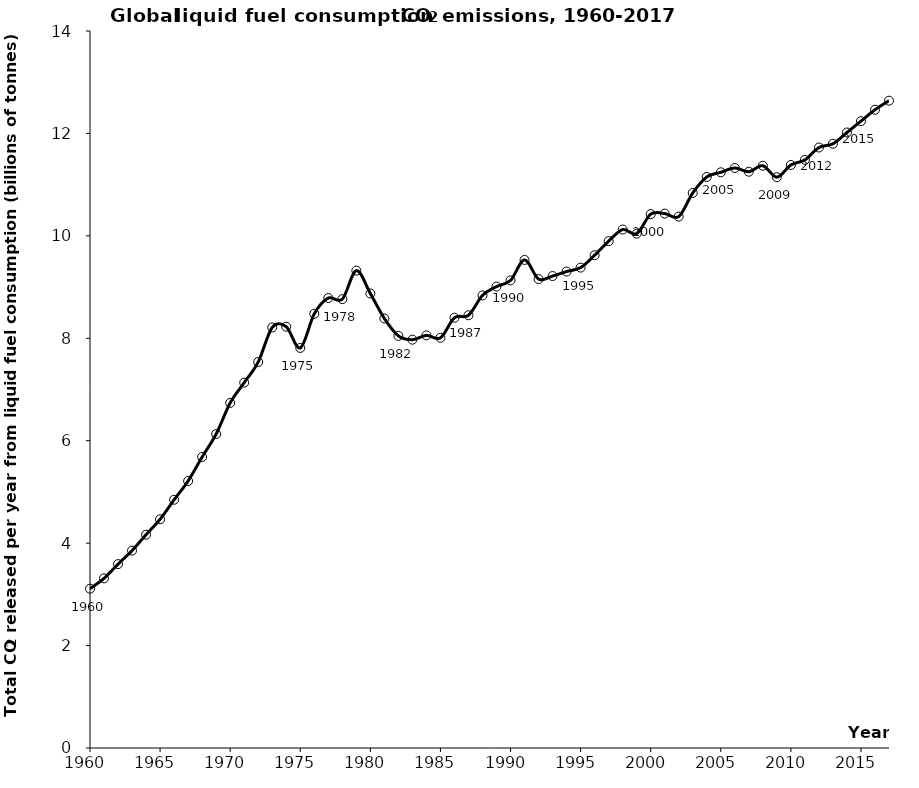
| Category | Series 0 |
|---|---|
| 1960.0 | 3.111 |
| 1961.0 | 3.312 |
| 1962.0 | 3.591 |
| 1963.0 | 3.855 |
| 1964.0 | 4.166 |
| 1965.0 | 4.466 |
| 1966.0 | 4.847 |
| 1967.0 | 5.214 |
| 1968.0 | 5.683 |
| 1969.0 | 6.13 |
| 1970.0 | 6.738 |
| 1971.0 | 7.134 |
| 1972.0 | 7.537 |
| 1973.0 | 8.211 |
| 1974.0 | 8.226 |
| 1975.0 | 7.812 |
| 1976.0 | 8.478 |
| 1977.0 | 8.786 |
| 1978.0 | 8.764 |
| 1979.0 | 9.321 |
| 1980.0 | 8.874 |
| 1981.0 | 8.387 |
| 1982.0 | 8.046 |
| 1983.0 | 7.973 |
| 1984.0 | 8.057 |
| 1985.0 | 8.01 |
| 1986.0 | 8.402 |
| 1987.0 | 8.449 |
| 1988.0 | 8.838 |
| 1989.0 | 9.01 |
| 1990.0 | 9.131 |
| 1991.0 | 9.53 |
| 1992.0 | 9.156 |
| 1993.0 | 9.215 |
| 1994.0 | 9.303 |
| 1995.0 | 9.38 |
| 1996.0 | 9.622 |
| 1997.0 | 9.896 |
| 1998.0 | 10.124 |
| 1999.0 | 10.043 |
| 2000.0 | 10.424 |
| 2001.0 | 10.435 |
| 2002.0 | 10.376 |
| 2003.0 | 10.838 |
| 2004.0 | 11.15 |
| 2005.0 | 11.241 |
| 2006.0 | 11.325 |
| 2007.0 | 11.252 |
| 2008.0 | 11.369 |
| 2009.0 | 11.146 |
| 2010.0 | 11.384 |
| 2011.0 | 11.483 |
| 2012.0 | 11.725 |
| 2013.0 | 11.798 |
| 2014.0 | 12.018 |
| 2015.0 | 12.24 |
| 2016.0 | 12.463 |
| 2017.0 | 12.639 |